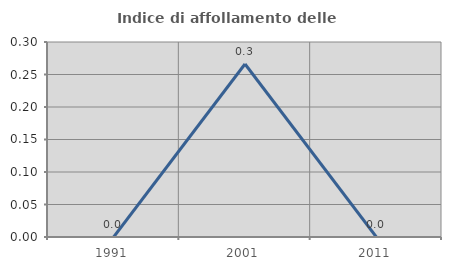
| Category | Indice di affollamento delle abitazioni  |
|---|---|
| 1991.0 | 0 |
| 2001.0 | 0.266 |
| 2011.0 | 0 |